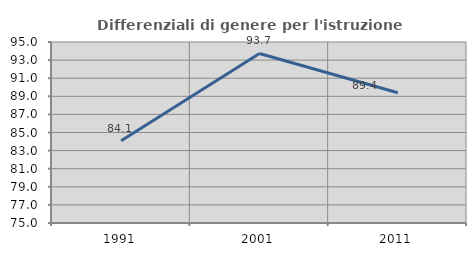
| Category | Differenziali di genere per l'istruzione superiore |
|---|---|
| 1991.0 | 84.089 |
| 2001.0 | 93.734 |
| 2011.0 | 89.393 |